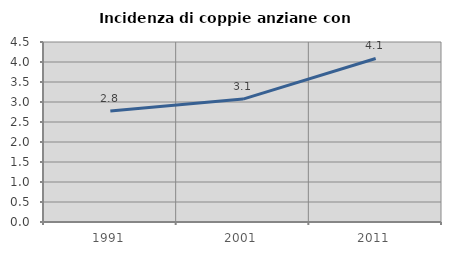
| Category | Incidenza di coppie anziane con figli |
|---|---|
| 1991.0 | 2.772 |
| 2001.0 | 3.072 |
| 2011.0 | 4.089 |